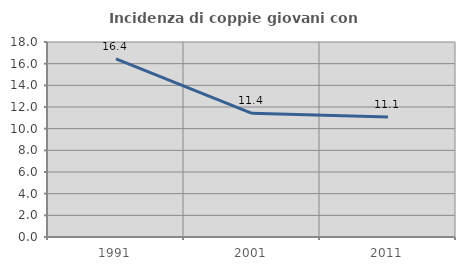
| Category | Incidenza di coppie giovani con figli |
|---|---|
| 1991.0 | 16.44 |
| 2001.0 | 11.415 |
| 2011.0 | 11.079 |